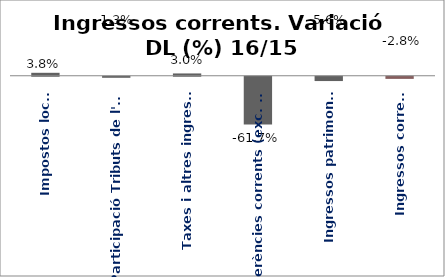
| Category | Series 0 |
|---|---|
| Impostos locals | 0.038 |
| Participació Tributs de l'Estat | -0.013 |
| Taxes i altres ingressos | 0.03 |
| Transferències corrents (exc. FCF) | -0.617 |
| Ingressos patrimonials | -0.056 |
| Ingressos corrents | -0.028 |